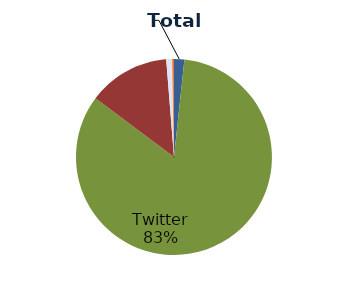
| Category | Total Engagements |
|---|---|
| Facebook | 435 |
| Twitter | 21356 |
| YouTube | 3456 |
| LinkedIn | 235 |
| Google+ | 65 |
| Pinterest | 23 |
| Foursquare | 2 |